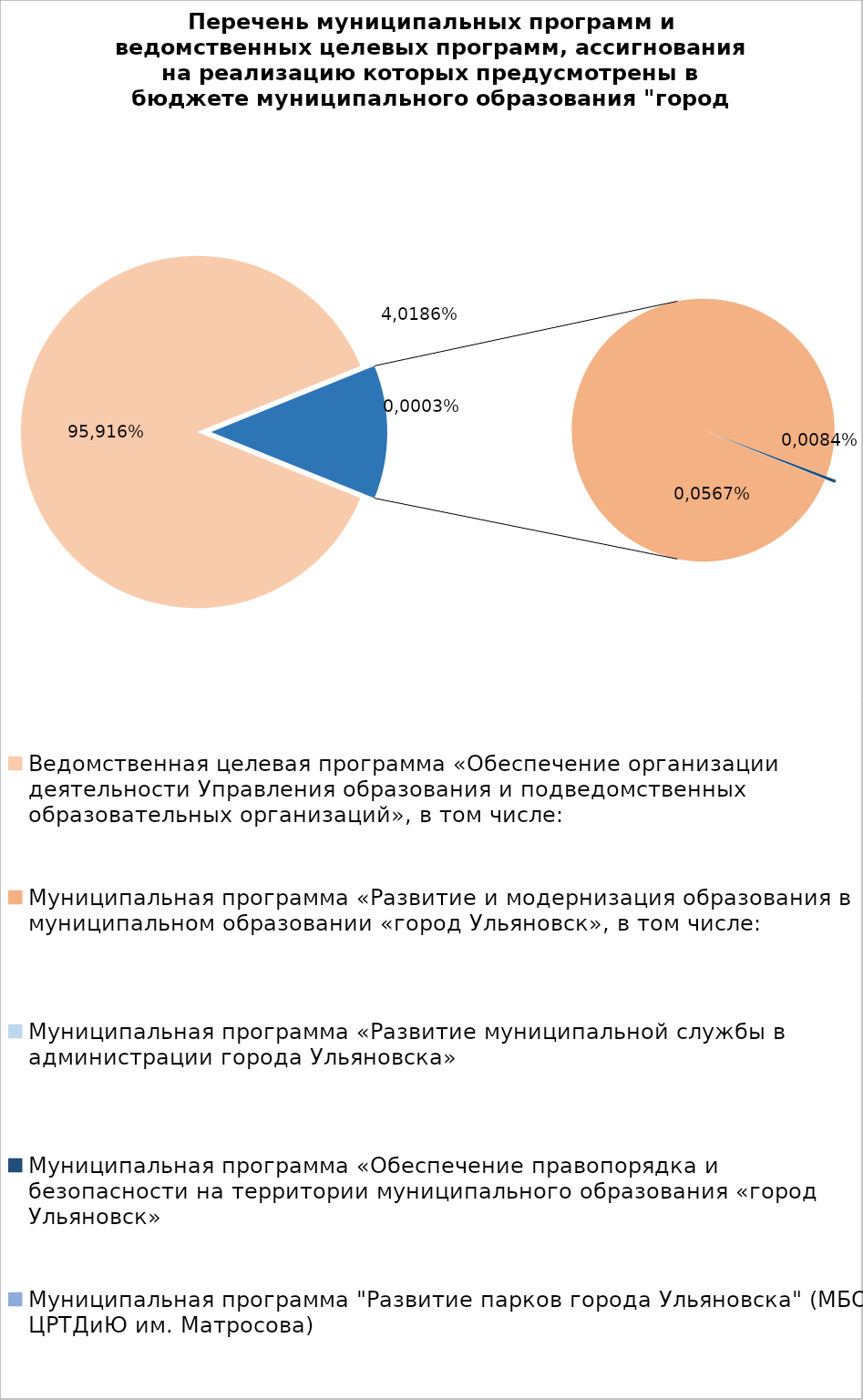
| Category | Series 0 |
|---|---|
| Ведомственная целевая программа «Обеспечение организации деятельности Управления образования и подведомственных образовательных организаций», в том числе: | 5229587.84 |
| Муниципальная программа «Развитие и модернизация образования в муниципальном образовании «город Ульяновск», в том числе: | 727499.72 |
| Муниципальная программа «Развитие муниципальной службы в администрации города Ульяновска» | 14.3 |
| Муниципальная программа «Обеспечение правопорядка и безопасности на территории муниципального образования «город Ульяновск» | 2700 |
| Муниципальная программа "Развитие парков города Ульяновска" (МБОУ ЦРТДиЮ им. Матросова) | 400 |